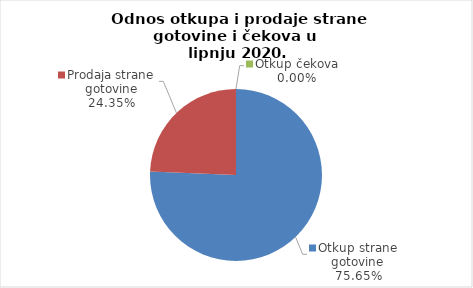
| Category | Series 0 |
|---|---|
| Otkup strane gotovine | 75.654 |
| Prodaja strane gotovine | 24.346 |
| Otkup čekova | 0 |